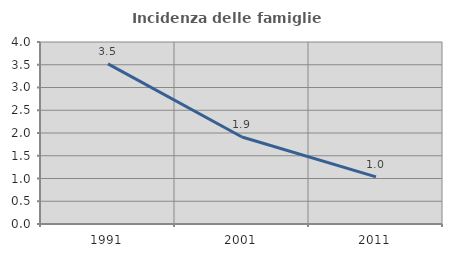
| Category | Incidenza delle famiglie numerose |
|---|---|
| 1991.0 | 3.519 |
| 2001.0 | 1.913 |
| 2011.0 | 1.036 |